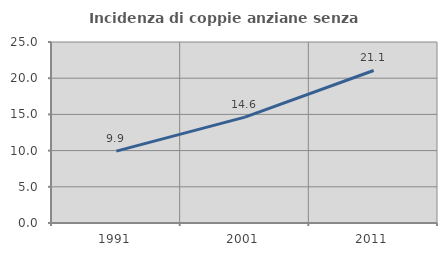
| Category | Incidenza di coppie anziane senza figli  |
|---|---|
| 1991.0 | 9.928 |
| 2001.0 | 14.622 |
| 2011.0 | 21.065 |